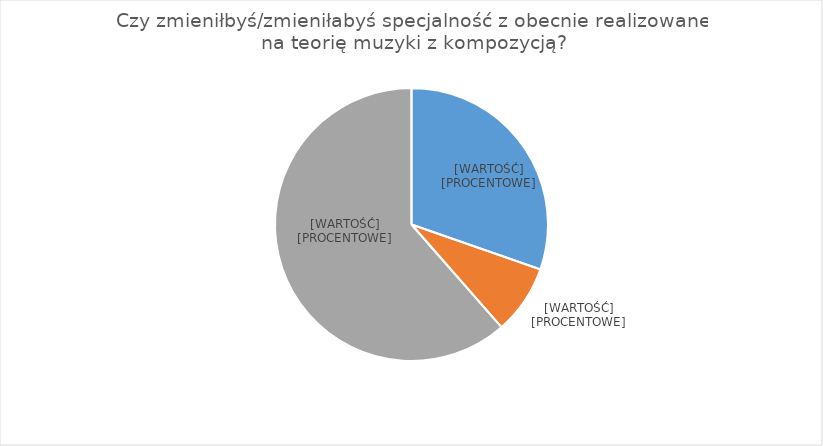
| Category | Series 0 |
|---|---|
| Tak - podstawy kompozycji
 | 580 |
| Tak - teoria muzyki
 | 157 |
| Nie | 1175 |